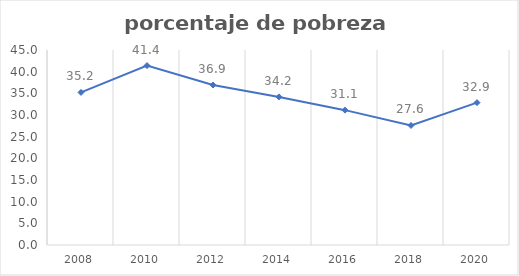
| Category | Series 0 |
|---|---|
| 2008.0 | 35.214 |
| 2010.0 | 41.411 |
| 2012.0 | 36.917 |
| 2014.0 | 34.175 |
| 2016.0 | 31.119 |
| 2018.0 | 27.581 |
| 2020.0 | 32.854 |